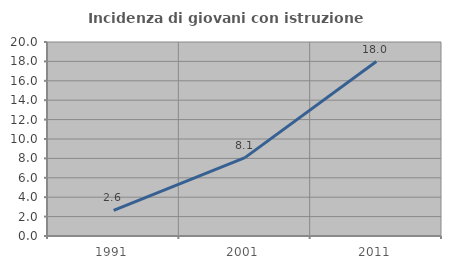
| Category | Incidenza di giovani con istruzione universitaria |
|---|---|
| 1991.0 | 2.64 |
| 2001.0 | 8.084 |
| 2011.0 | 17.982 |